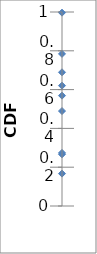
| Category | 0.5 |
|---|---|
| 0.0 | 0.62 |
| 0.0 | 0.689 |
| 0.0 | 0.569 |
| 0.0 | 0.489 |
| 0.0 | 0.274 |
| 0.0 | 0.997 |
| 0.0 | 0.784 |
| 0.0 | 0.167 |
| 0.0 | 0.267 |